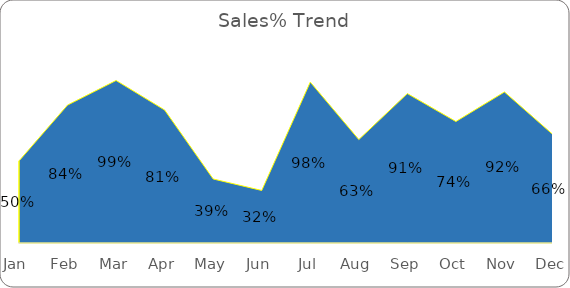
| Category | Sales% |
|---|---|
| Jan | 0.5 |
| Feb | 0.84 |
| Mar | 0.99 |
| Apr | 0.81 |
| May | 0.39 |
| Jun | 0.32 |
| Jul | 0.98 |
| Aug | 0.63 |
| Sep | 0.91 |
| Oct | 0.74 |
| Nov | 0.92 |
| Dec | 0.66 |